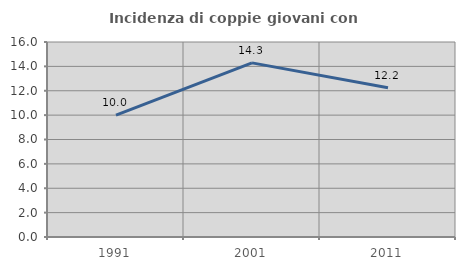
| Category | Incidenza di coppie giovani con figli |
|---|---|
| 1991.0 | 10 |
| 2001.0 | 14.286 |
| 2011.0 | 12.245 |